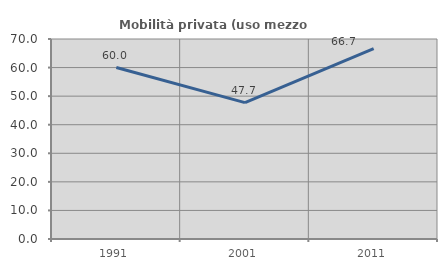
| Category | Mobilità privata (uso mezzo privato) |
|---|---|
| 1991.0 | 60 |
| 2001.0 | 47.727 |
| 2011.0 | 66.667 |